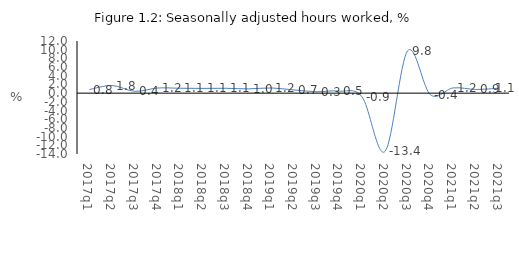
| Category | Series 0 |
|---|---|
| 2017q1 | 0.829 |
| 2017q2 | 1.752 |
| 2017q3 | 0.423 |
| 2017q4 | 1.181 |
| 2018q1 | 1.122 |
| 2018q2 | 1.093 |
| 2018q3 | 1.12 |
| 2018q4 | 0.983 |
| 2019q1 | 1.198 |
| 2019q2 | 0.733 |
| 2019q3 | 0.327 |
| 2019q4 | 0.479 |
| 2020q1 | -0.911 |
| 2020q2 | -13.42 |
| 2020q3 | 9.76 |
| 2020q4 | -0.359 |
| 2021q1 | 1.206 |
| 2021q2 | 0.856 |
| 2021q3 | 1.131 |